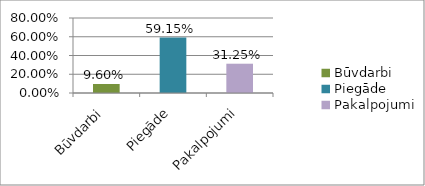
| Category | Series 0 |
|---|---|
| Būvdarbi | 0.096 |
| Piegāde | 0.592 |
| Pakalpojumi | 0.312 |